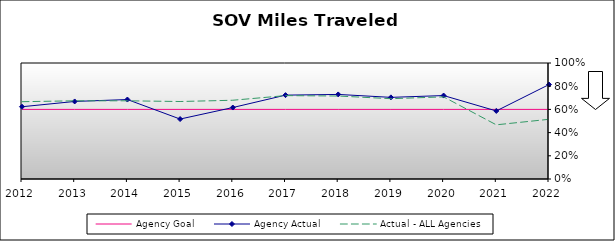
| Category | Agency Goal | Agency Actual | Actual - ALL Agencies |
|---|---|---|---|
| 2012.0 | 0.6 | 0.623 | 0.666 |
| 2013.0 | 0.6 | 0.668 | 0.674 |
| 2014.0 | 0.6 | 0.685 | 0.674 |
| 2015.0 | 0.6 | 0.517 | 0.668 |
| 2016.0 | 0.6 | 0.616 | 0.679 |
| 2017.0 | 0.6 | 0.723 | 0.719 |
| 2018.0 | 0.6 | 0.729 | 0.715 |
| 2019.0 | 0.6 | 0.704 | 0.692 |
| 2020.0 | 0.6 | 0.719 | 0.708 |
| 2021.0 | 0.6 | 0.587 | 0.467 |
| 2022.0 | 0.6 | 0.814 | 0.515 |